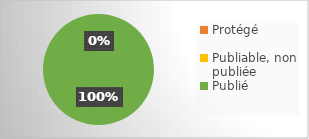
| Category | Series 0 |
|---|---|
| Protégé | 0 |
| Publiable, non publiée | 0 |
| Publié | 1 |